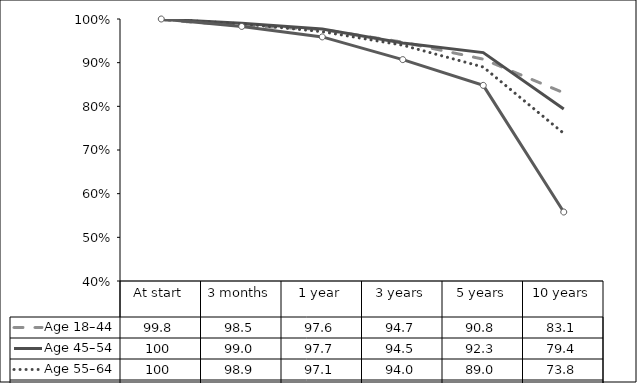
| Category | Age 18–44  | Age 45–54  | Age 55–64  | Age 65+  |
|---|---|---|---|---|
| At start | 99.8 | 100 | 100 | 100 |
| 3 months | 98.5 | 99 | 98.9 | 98.3 |
| 1 year | 97.6 | 97.7 | 97.1 | 95.9 |
| 3 years | 94.7 | 94.5 | 94 | 90.7 |
| 5 years | 90.8 | 92.3 | 89 | 84.8 |
| 10 years | 83.1 | 79.4 | 73.8 | 55.8 |